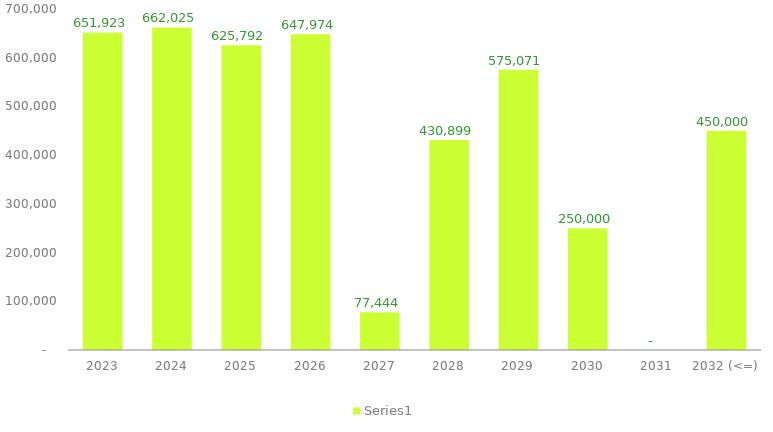
| Category | Series 0 |
|---|---|
| 2023 | 651923.414 |
| 2024 | 662025.271 |
| 2025 | 625791.857 |
| 2026 | 647973.697 |
| 2027 | 77444.022 |
| 2028 | 430899.316 |
| 2029 | 575071 |
| 2030 | 250000 |
| 2031 | 0 |
| 2032 (<=) | 450000 |